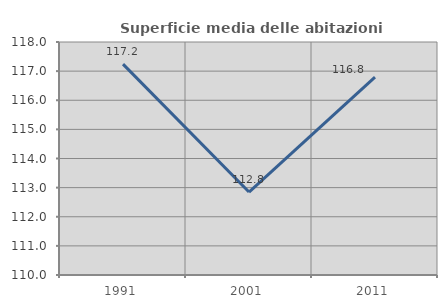
| Category | Superficie media delle abitazioni occupate |
|---|---|
| 1991.0 | 117.242 |
| 2001.0 | 112.848 |
| 2011.0 | 116.794 |